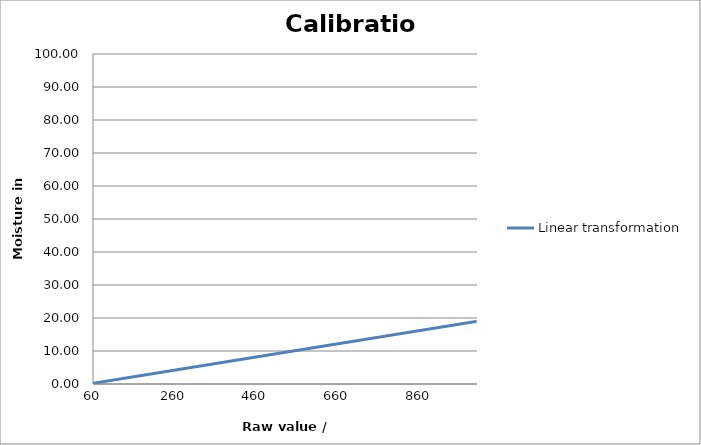
| Category | Linear transformation |
|---|---|
| 60.0 | 0.2 |
| 61.0 | 0.22 |
| 62.0 | 0.24 |
| 63.0 | 0.26 |
| 64.0 | 0.28 |
| 65.0 | 0.3 |
| 66.0 | 0.32 |
| 67.0 | 0.34 |
| 68.0 | 0.36 |
| 69.0 | 0.38 |
| 70.0 | 0.4 |
| 71.0 | 0.42 |
| 72.0 | 0.44 |
| 73.0 | 0.46 |
| 74.0 | 0.48 |
| 75.0 | 0.5 |
| 76.0 | 0.52 |
| 77.0 | 0.54 |
| 78.0 | 0.56 |
| 79.0 | 0.58 |
| 80.0 | 0.6 |
| 81.0 | 0.62 |
| 82.0 | 0.64 |
| 83.0 | 0.66 |
| 84.0 | 0.68 |
| 85.0 | 0.7 |
| 86.0 | 0.72 |
| 87.0 | 0.74 |
| 88.0 | 0.76 |
| 89.0 | 0.78 |
| 90.0 | 0.8 |
| 91.0 | 0.82 |
| 92.0 | 0.84 |
| 93.0 | 0.86 |
| 94.0 | 0.88 |
| 95.0 | 0.9 |
| 96.0 | 0.92 |
| 97.0 | 0.94 |
| 98.0 | 0.96 |
| 99.0 | 0.98 |
| 100.0 | 1 |
| 101.0 | 1.02 |
| 102.0 | 1.04 |
| 103.0 | 1.06 |
| 104.0 | 1.08 |
| 105.0 | 1.1 |
| 106.0 | 1.12 |
| 107.0 | 1.14 |
| 108.0 | 1.16 |
| 109.0 | 1.18 |
| 110.0 | 1.2 |
| 111.0 | 1.22 |
| 112.0 | 1.24 |
| 113.0 | 1.26 |
| 114.0 | 1.28 |
| 115.0 | 1.3 |
| 116.0 | 1.32 |
| 117.0 | 1.34 |
| 118.0 | 1.36 |
| 119.0 | 1.38 |
| 120.0 | 1.4 |
| 121.0 | 1.42 |
| 122.0 | 1.44 |
| 123.0 | 1.46 |
| 124.0 | 1.48 |
| 125.0 | 1.5 |
| 126.0 | 1.52 |
| 127.0 | 1.54 |
| 128.0 | 1.56 |
| 129.0 | 1.58 |
| 130.0 | 1.6 |
| 131.0 | 1.62 |
| 132.0 | 1.64 |
| 133.0 | 1.66 |
| 134.0 | 1.68 |
| 135.0 | 1.7 |
| 136.0 | 1.72 |
| 137.0 | 1.74 |
| 138.0 | 1.76 |
| 139.0 | 1.78 |
| 140.0 | 1.8 |
| 141.0 | 1.82 |
| 142.0 | 1.84 |
| 143.0 | 1.86 |
| 144.0 | 1.88 |
| 145.0 | 1.9 |
| 146.0 | 1.92 |
| 147.0 | 1.94 |
| 148.0 | 1.96 |
| 149.0 | 1.98 |
| 150.0 | 2 |
| 151.0 | 2.02 |
| 152.0 | 2.04 |
| 153.0 | 2.06 |
| 154.0 | 2.08 |
| 155.0 | 2.1 |
| 156.0 | 2.12 |
| 157.0 | 2.14 |
| 158.0 | 2.16 |
| 159.0 | 2.18 |
| 160.0 | 2.2 |
| 161.0 | 2.22 |
| 162.0 | 2.24 |
| 163.0 | 2.26 |
| 164.0 | 2.28 |
| 165.0 | 2.3 |
| 166.0 | 2.32 |
| 167.0 | 2.34 |
| 168.0 | 2.36 |
| 169.0 | 2.38 |
| 170.0 | 2.4 |
| 171.0 | 2.42 |
| 172.0 | 2.44 |
| 173.0 | 2.46 |
| 174.0 | 2.48 |
| 175.0 | 2.5 |
| 176.0 | 2.52 |
| 177.0 | 2.54 |
| 178.0 | 2.56 |
| 179.0 | 2.58 |
| 180.0 | 2.6 |
| 181.0 | 2.62 |
| 182.0 | 2.64 |
| 183.0 | 2.66 |
| 184.0 | 2.68 |
| 185.0 | 2.7 |
| 186.0 | 2.72 |
| 187.0 | 2.74 |
| 188.0 | 2.76 |
| 189.0 | 2.78 |
| 190.0 | 2.8 |
| 191.0 | 2.82 |
| 192.0 | 2.84 |
| 193.0 | 2.86 |
| 194.0 | 2.88 |
| 195.0 | 2.9 |
| 196.0 | 2.92 |
| 197.0 | 2.94 |
| 198.0 | 2.96 |
| 199.0 | 2.98 |
| 200.0 | 3 |
| 201.0 | 3.02 |
| 202.0 | 3.04 |
| 203.0 | 3.06 |
| 204.0 | 3.08 |
| 205.0 | 3.1 |
| 206.0 | 3.12 |
| 207.0 | 3.14 |
| 208.0 | 3.16 |
| 209.0 | 3.18 |
| 210.0 | 3.2 |
| 211.0 | 3.22 |
| 212.0 | 3.24 |
| 213.0 | 3.26 |
| 214.0 | 3.28 |
| 215.0 | 3.3 |
| 216.0 | 3.32 |
| 217.0 | 3.34 |
| 218.0 | 3.36 |
| 219.0 | 3.38 |
| 220.0 | 3.4 |
| 221.0 | 3.42 |
| 222.0 | 3.44 |
| 223.0 | 3.46 |
| 224.0 | 3.48 |
| 225.0 | 3.5 |
| 226.0 | 3.52 |
| 227.0 | 3.54 |
| 228.0 | 3.56 |
| 229.0 | 3.58 |
| 230.0 | 3.6 |
| 231.0 | 3.62 |
| 232.0 | 3.64 |
| 233.0 | 3.66 |
| 234.0 | 3.68 |
| 235.0 | 3.7 |
| 236.0 | 3.72 |
| 237.0 | 3.74 |
| 238.0 | 3.76 |
| 239.0 | 3.78 |
| 240.0 | 3.8 |
| 241.0 | 3.82 |
| 242.0 | 3.84 |
| 243.0 | 3.86 |
| 244.0 | 3.88 |
| 245.0 | 3.9 |
| 246.0 | 3.92 |
| 247.0 | 3.94 |
| 248.0 | 3.96 |
| 249.0 | 3.98 |
| 250.0 | 4 |
| 251.0 | 4.02 |
| 252.0 | 4.04 |
| 253.0 | 4.06 |
| 254.0 | 4.08 |
| 255.0 | 4.1 |
| 256.0 | 4.12 |
| 257.0 | 4.14 |
| 258.0 | 4.16 |
| 259.0 | 4.18 |
| 260.0 | 4.2 |
| 261.0 | 4.22 |
| 262.0 | 4.24 |
| 263.0 | 4.26 |
| 264.0 | 4.28 |
| 265.0 | 4.3 |
| 266.0 | 4.32 |
| 267.0 | 4.34 |
| 268.0 | 4.36 |
| 269.0 | 4.38 |
| 270.0 | 4.4 |
| 271.0 | 4.42 |
| 272.0 | 4.44 |
| 273.0 | 4.46 |
| 274.0 | 4.48 |
| 275.0 | 4.5 |
| 276.0 | 4.52 |
| 277.0 | 4.54 |
| 278.0 | 4.56 |
| 279.0 | 4.58 |
| 280.0 | 4.6 |
| 281.0 | 4.62 |
| 282.0 | 4.64 |
| 283.0 | 4.66 |
| 284.0 | 4.68 |
| 285.0 | 4.7 |
| 286.0 | 4.72 |
| 287.0 | 4.74 |
| 288.0 | 4.76 |
| 289.0 | 4.78 |
| 290.0 | 4.8 |
| 291.0 | 4.82 |
| 292.0 | 4.84 |
| 293.0 | 4.86 |
| 294.0 | 4.88 |
| 295.0 | 4.9 |
| 296.0 | 4.92 |
| 297.0 | 4.94 |
| 298.0 | 4.96 |
| 299.0 | 4.98 |
| 300.0 | 5 |
| 301.0 | 5.02 |
| 302.0 | 5.04 |
| 303.0 | 5.06 |
| 304.0 | 5.08 |
| 305.0 | 5.1 |
| 306.0 | 5.12 |
| 307.0 | 5.14 |
| 308.0 | 5.16 |
| 309.0 | 5.18 |
| 310.0 | 5.2 |
| 311.0 | 5.22 |
| 312.0 | 5.24 |
| 313.0 | 5.26 |
| 314.0 | 5.28 |
| 315.0 | 5.3 |
| 316.0 | 5.32 |
| 317.0 | 5.34 |
| 318.0 | 5.36 |
| 319.0 | 5.38 |
| 320.0 | 5.4 |
| 321.0 | 5.42 |
| 322.0 | 5.44 |
| 323.0 | 5.46 |
| 324.0 | 5.48 |
| 325.0 | 5.5 |
| 326.0 | 5.52 |
| 327.0 | 5.54 |
| 328.0 | 5.56 |
| 329.0 | 5.58 |
| 330.0 | 5.6 |
| 331.0 | 5.62 |
| 332.0 | 5.64 |
| 333.0 | 5.66 |
| 334.0 | 5.68 |
| 335.0 | 5.7 |
| 336.0 | 5.72 |
| 337.0 | 5.74 |
| 338.0 | 5.76 |
| 339.0 | 5.78 |
| 340.0 | 5.8 |
| 341.0 | 5.82 |
| 342.0 | 5.84 |
| 343.0 | 5.86 |
| 344.0 | 5.88 |
| 345.0 | 5.9 |
| 346.0 | 5.92 |
| 347.0 | 5.94 |
| 348.0 | 5.96 |
| 349.0 | 5.98 |
| 350.0 | 6 |
| 351.0 | 6.02 |
| 352.0 | 6.04 |
| 353.0 | 6.06 |
| 354.0 | 6.08 |
| 355.0 | 6.1 |
| 356.0 | 6.12 |
| 357.0 | 6.14 |
| 358.0 | 6.16 |
| 359.0 | 6.18 |
| 360.0 | 6.2 |
| 361.0 | 6.22 |
| 362.0 | 6.24 |
| 363.0 | 6.26 |
| 364.0 | 6.28 |
| 365.0 | 6.3 |
| 366.0 | 6.32 |
| 367.0 | 6.34 |
| 368.0 | 6.36 |
| 369.0 | 6.38 |
| 370.0 | 6.4 |
| 371.0 | 6.42 |
| 372.0 | 6.44 |
| 373.0 | 6.46 |
| 374.0 | 6.48 |
| 375.0 | 6.5 |
| 376.0 | 6.52 |
| 377.0 | 6.54 |
| 378.0 | 6.56 |
| 379.0 | 6.58 |
| 380.0 | 6.6 |
| 381.0 | 6.62 |
| 382.0 | 6.64 |
| 383.0 | 6.66 |
| 384.0 | 6.68 |
| 385.0 | 6.7 |
| 386.0 | 6.72 |
| 387.0 | 6.74 |
| 388.0 | 6.76 |
| 389.0 | 6.78 |
| 390.0 | 6.8 |
| 391.0 | 6.82 |
| 392.0 | 6.84 |
| 393.0 | 6.86 |
| 394.0 | 6.88 |
| 395.0 | 6.9 |
| 396.0 | 6.92 |
| 397.0 | 6.94 |
| 398.0 | 6.96 |
| 399.0 | 6.98 |
| 400.0 | 7 |
| 401.0 | 7.02 |
| 402.0 | 7.04 |
| 403.0 | 7.06 |
| 404.0 | 7.08 |
| 405.0 | 7.1 |
| 406.0 | 7.12 |
| 407.0 | 7.14 |
| 408.0 | 7.16 |
| 409.0 | 7.18 |
| 410.0 | 7.2 |
| 411.0 | 7.22 |
| 412.0 | 7.24 |
| 413.0 | 7.26 |
| 414.0 | 7.28 |
| 415.0 | 7.3 |
| 416.0 | 7.32 |
| 417.0 | 7.34 |
| 418.0 | 7.36 |
| 419.0 | 7.38 |
| 420.0 | 7.4 |
| 421.0 | 7.42 |
| 422.0 | 7.44 |
| 423.0 | 7.46 |
| 424.0 | 7.48 |
| 425.0 | 7.5 |
| 426.0 | 7.52 |
| 427.0 | 7.54 |
| 428.0 | 7.56 |
| 429.0 | 7.58 |
| 430.0 | 7.6 |
| 431.0 | 7.62 |
| 432.0 | 7.64 |
| 433.0 | 7.66 |
| 434.0 | 7.68 |
| 435.0 | 7.7 |
| 436.0 | 7.72 |
| 437.0 | 7.74 |
| 438.0 | 7.76 |
| 439.0 | 7.78 |
| 440.0 | 7.8 |
| 441.0 | 7.82 |
| 442.0 | 7.84 |
| 443.0 | 7.86 |
| 444.0 | 7.88 |
| 445.0 | 7.9 |
| 446.0 | 7.92 |
| 447.0 | 7.94 |
| 448.0 | 7.96 |
| 449.0 | 7.98 |
| 450.0 | 8 |
| 451.0 | 8.02 |
| 452.0 | 8.04 |
| 453.0 | 8.06 |
| 454.0 | 8.08 |
| 455.0 | 8.1 |
| 456.0 | 8.12 |
| 457.0 | 8.14 |
| 458.0 | 8.16 |
| 459.0 | 8.18 |
| 460.0 | 8.2 |
| 461.0 | 8.22 |
| 462.0 | 8.24 |
| 463.0 | 8.26 |
| 464.0 | 8.28 |
| 465.0 | 8.3 |
| 466.0 | 8.32 |
| 467.0 | 8.34 |
| 468.0 | 8.36 |
| 469.0 | 8.38 |
| 470.0 | 8.4 |
| 471.0 | 8.42 |
| 472.0 | 8.44 |
| 473.0 | 8.46 |
| 474.0 | 8.48 |
| 475.0 | 8.5 |
| 476.0 | 8.52 |
| 477.0 | 8.54 |
| 478.0 | 8.56 |
| 479.0 | 8.58 |
| 480.0 | 8.6 |
| 481.0 | 8.62 |
| 482.0 | 8.64 |
| 483.0 | 8.66 |
| 484.0 | 8.68 |
| 485.0 | 8.7 |
| 486.0 | 8.72 |
| 487.0 | 8.74 |
| 488.0 | 8.76 |
| 489.0 | 8.78 |
| 490.0 | 8.8 |
| 491.0 | 8.82 |
| 492.0 | 8.84 |
| 493.0 | 8.86 |
| 494.0 | 8.88 |
| 495.0 | 8.9 |
| 496.0 | 8.92 |
| 497.0 | 8.94 |
| 498.0 | 8.96 |
| 499.0 | 8.98 |
| 500.0 | 9 |
| 501.0 | 9.02 |
| 502.0 | 9.04 |
| 503.0 | 9.06 |
| 504.0 | 9.08 |
| 505.0 | 9.1 |
| 506.0 | 9.12 |
| 507.0 | 9.14 |
| 508.0 | 9.16 |
| 509.0 | 9.18 |
| 510.0 | 9.2 |
| 511.0 | 9.22 |
| 512.0 | 9.24 |
| 513.0 | 9.26 |
| 514.0 | 9.28 |
| 515.0 | 9.3 |
| 516.0 | 9.32 |
| 517.0 | 9.34 |
| 518.0 | 9.36 |
| 519.0 | 9.38 |
| 520.0 | 9.4 |
| 521.0 | 9.42 |
| 522.0 | 9.44 |
| 523.0 | 9.46 |
| 524.0 | 9.48 |
| 525.0 | 9.5 |
| 526.0 | 9.52 |
| 527.0 | 9.54 |
| 528.0 | 9.56 |
| 529.0 | 9.58 |
| 530.0 | 9.6 |
| 531.0 | 9.62 |
| 532.0 | 9.64 |
| 533.0 | 9.66 |
| 534.0 | 9.68 |
| 535.0 | 9.7 |
| 536.0 | 9.72 |
| 537.0 | 9.74 |
| 538.0 | 9.76 |
| 539.0 | 9.78 |
| 540.0 | 9.8 |
| 541.0 | 9.82 |
| 542.0 | 9.84 |
| 543.0 | 9.86 |
| 544.0 | 9.88 |
| 545.0 | 9.9 |
| 546.0 | 9.92 |
| 547.0 | 9.94 |
| 548.0 | 9.96 |
| 549.0 | 9.98 |
| 550.0 | 10 |
| 551.0 | 10.02 |
| 552.0 | 10.04 |
| 553.0 | 10.06 |
| 554.0 | 10.08 |
| 555.0 | 10.1 |
| 556.0 | 10.12 |
| 557.0 | 10.14 |
| 558.0 | 10.16 |
| 559.0 | 10.18 |
| 560.0 | 10.2 |
| 561.0 | 10.22 |
| 562.0 | 10.24 |
| 563.0 | 10.26 |
| 564.0 | 10.28 |
| 565.0 | 10.3 |
| 566.0 | 10.32 |
| 567.0 | 10.34 |
| 568.0 | 10.36 |
| 569.0 | 10.38 |
| 570.0 | 10.4 |
| 571.0 | 10.42 |
| 572.0 | 10.44 |
| 573.0 | 10.46 |
| 574.0 | 10.48 |
| 575.0 | 10.5 |
| 576.0 | 10.52 |
| 577.0 | 10.54 |
| 578.0 | 10.56 |
| 579.0 | 10.58 |
| 580.0 | 10.6 |
| 581.0 | 10.62 |
| 582.0 | 10.64 |
| 583.0 | 10.66 |
| 584.0 | 10.68 |
| 585.0 | 10.7 |
| 586.0 | 10.72 |
| 587.0 | 10.74 |
| 588.0 | 10.76 |
| 589.0 | 10.78 |
| 590.0 | 10.8 |
| 591.0 | 10.82 |
| 592.0 | 10.84 |
| 593.0 | 10.86 |
| 594.0 | 10.88 |
| 595.0 | 10.9 |
| 596.0 | 10.92 |
| 597.0 | 10.94 |
| 598.0 | 10.96 |
| 599.0 | 10.98 |
| 600.0 | 11 |
| 601.0 | 11.02 |
| 602.0 | 11.04 |
| 603.0 | 11.06 |
| 604.0 | 11.08 |
| 605.0 | 11.1 |
| 606.0 | 11.12 |
| 607.0 | 11.14 |
| 608.0 | 11.16 |
| 609.0 | 11.18 |
| 610.0 | 11.2 |
| 611.0 | 11.22 |
| 612.0 | 11.24 |
| 613.0 | 11.26 |
| 614.0 | 11.28 |
| 615.0 | 11.3 |
| 616.0 | 11.32 |
| 617.0 | 11.34 |
| 618.0 | 11.36 |
| 619.0 | 11.38 |
| 620.0 | 11.4 |
| 621.0 | 11.42 |
| 622.0 | 11.44 |
| 623.0 | 11.46 |
| 624.0 | 11.48 |
| 625.0 | 11.5 |
| 626.0 | 11.52 |
| 627.0 | 11.54 |
| 628.0 | 11.56 |
| 629.0 | 11.58 |
| 630.0 | 11.6 |
| 631.0 | 11.62 |
| 632.0 | 11.64 |
| 633.0 | 11.66 |
| 634.0 | 11.68 |
| 635.0 | 11.7 |
| 636.0 | 11.72 |
| 637.0 | 11.74 |
| 638.0 | 11.76 |
| 639.0 | 11.78 |
| 640.0 | 11.8 |
| 641.0 | 11.82 |
| 642.0 | 11.84 |
| 643.0 | 11.86 |
| 644.0 | 11.88 |
| 645.0 | 11.9 |
| 646.0 | 11.92 |
| 647.0 | 11.94 |
| 648.0 | 11.96 |
| 649.0 | 11.98 |
| 650.0 | 12 |
| 651.0 | 12.02 |
| 652.0 | 12.04 |
| 653.0 | 12.06 |
| 654.0 | 12.08 |
| 655.0 | 12.1 |
| 656.0 | 12.12 |
| 657.0 | 12.14 |
| 658.0 | 12.16 |
| 659.0 | 12.18 |
| 660.0 | 12.2 |
| 661.0 | 12.22 |
| 662.0 | 12.24 |
| 663.0 | 12.26 |
| 664.0 | 12.28 |
| 665.0 | 12.3 |
| 666.0 | 12.32 |
| 667.0 | 12.34 |
| 668.0 | 12.36 |
| 669.0 | 12.38 |
| 670.0 | 12.4 |
| 671.0 | 12.42 |
| 672.0 | 12.44 |
| 673.0 | 12.46 |
| 674.0 | 12.48 |
| 675.0 | 12.5 |
| 676.0 | 12.52 |
| 677.0 | 12.54 |
| 678.0 | 12.56 |
| 679.0 | 12.58 |
| 680.0 | 12.6 |
| 681.0 | 12.62 |
| 682.0 | 12.64 |
| 683.0 | 12.66 |
| 684.0 | 12.68 |
| 685.0 | 12.7 |
| 686.0 | 12.72 |
| 687.0 | 12.74 |
| 688.0 | 12.76 |
| 689.0 | 12.78 |
| 690.0 | 12.8 |
| 691.0 | 12.82 |
| 692.0 | 12.84 |
| 693.0 | 12.86 |
| 694.0 | 12.88 |
| 695.0 | 12.9 |
| 696.0 | 12.92 |
| 697.0 | 12.94 |
| 698.0 | 12.96 |
| 699.0 | 12.98 |
| 700.0 | 13 |
| 701.0 | 13.02 |
| 702.0 | 13.04 |
| 703.0 | 13.06 |
| 704.0 | 13.08 |
| 705.0 | 13.1 |
| 706.0 | 13.12 |
| 707.0 | 13.14 |
| 708.0 | 13.16 |
| 709.0 | 13.18 |
| 710.0 | 13.2 |
| 711.0 | 13.22 |
| 712.0 | 13.24 |
| 713.0 | 13.26 |
| 714.0 | 13.28 |
| 715.0 | 13.3 |
| 716.0 | 13.32 |
| 717.0 | 13.34 |
| 718.0 | 13.36 |
| 719.0 | 13.38 |
| 720.0 | 13.4 |
| 721.0 | 13.42 |
| 722.0 | 13.44 |
| 723.0 | 13.46 |
| 724.0 | 13.48 |
| 725.0 | 13.5 |
| 726.0 | 13.52 |
| 727.0 | 13.54 |
| 728.0 | 13.56 |
| 729.0 | 13.58 |
| 730.0 | 13.6 |
| 731.0 | 13.62 |
| 732.0 | 13.64 |
| 733.0 | 13.66 |
| 734.0 | 13.68 |
| 735.0 | 13.7 |
| 736.0 | 13.72 |
| 737.0 | 13.74 |
| 738.0 | 13.76 |
| 739.0 | 13.78 |
| 740.0 | 13.8 |
| 741.0 | 13.82 |
| 742.0 | 13.84 |
| 743.0 | 13.86 |
| 744.0 | 13.88 |
| 745.0 | 13.9 |
| 746.0 | 13.92 |
| 747.0 | 13.94 |
| 748.0 | 13.96 |
| 749.0 | 13.98 |
| 750.0 | 14 |
| 751.0 | 14.02 |
| 752.0 | 14.04 |
| 753.0 | 14.06 |
| 754.0 | 14.08 |
| 755.0 | 14.1 |
| 756.0 | 14.12 |
| 757.0 | 14.14 |
| 758.0 | 14.16 |
| 759.0 | 14.18 |
| 760.0 | 14.2 |
| 761.0 | 14.22 |
| 762.0 | 14.24 |
| 763.0 | 14.26 |
| 764.0 | 14.28 |
| 765.0 | 14.3 |
| 766.0 | 14.32 |
| 767.0 | 14.34 |
| 768.0 | 14.36 |
| 769.0 | 14.38 |
| 770.0 | 14.4 |
| 771.0 | 14.42 |
| 772.0 | 14.44 |
| 773.0 | 14.46 |
| 774.0 | 14.48 |
| 775.0 | 14.5 |
| 776.0 | 14.52 |
| 777.0 | 14.54 |
| 778.0 | 14.56 |
| 779.0 | 14.58 |
| 780.0 | 14.6 |
| 781.0 | 14.62 |
| 782.0 | 14.64 |
| 783.0 | 14.66 |
| 784.0 | 14.68 |
| 785.0 | 14.7 |
| 786.0 | 14.72 |
| 787.0 | 14.74 |
| 788.0 | 14.76 |
| 789.0 | 14.78 |
| 790.0 | 14.8 |
| 791.0 | 14.82 |
| 792.0 | 14.84 |
| 793.0 | 14.86 |
| 794.0 | 14.88 |
| 795.0 | 14.9 |
| 796.0 | 14.92 |
| 797.0 | 14.94 |
| 798.0 | 14.96 |
| 799.0 | 14.98 |
| 800.0 | 15 |
| 801.0 | 15.02 |
| 802.0 | 15.04 |
| 803.0 | 15.06 |
| 804.0 | 15.08 |
| 805.0 | 15.1 |
| 806.0 | 15.12 |
| 807.0 | 15.14 |
| 808.0 | 15.16 |
| 809.0 | 15.18 |
| 810.0 | 15.2 |
| 811.0 | 15.22 |
| 812.0 | 15.24 |
| 813.0 | 15.26 |
| 814.0 | 15.28 |
| 815.0 | 15.3 |
| 816.0 | 15.32 |
| 817.0 | 15.34 |
| 818.0 | 15.36 |
| 819.0 | 15.38 |
| 820.0 | 15.4 |
| 821.0 | 15.42 |
| 822.0 | 15.44 |
| 823.0 | 15.46 |
| 824.0 | 15.48 |
| 825.0 | 15.5 |
| 826.0 | 15.52 |
| 827.0 | 15.54 |
| 828.0 | 15.56 |
| 829.0 | 15.58 |
| 830.0 | 15.6 |
| 831.0 | 15.62 |
| 832.0 | 15.64 |
| 833.0 | 15.66 |
| 834.0 | 15.68 |
| 835.0 | 15.7 |
| 836.0 | 15.72 |
| 837.0 | 15.74 |
| 838.0 | 15.76 |
| 839.0 | 15.78 |
| 840.0 | 15.8 |
| 841.0 | 15.82 |
| 842.0 | 15.84 |
| 843.0 | 15.86 |
| 844.0 | 15.88 |
| 845.0 | 15.9 |
| 846.0 | 15.92 |
| 847.0 | 15.94 |
| 848.0 | 15.96 |
| 849.0 | 15.98 |
| 850.0 | 16 |
| 851.0 | 16.02 |
| 852.0 | 16.04 |
| 853.0 | 16.06 |
| 854.0 | 16.08 |
| 855.0 | 16.1 |
| 856.0 | 16.12 |
| 857.0 | 16.14 |
| 858.0 | 16.16 |
| 859.0 | 16.18 |
| 860.0 | 16.2 |
| 861.0 | 16.22 |
| 862.0 | 16.24 |
| 863.0 | 16.26 |
| 864.0 | 16.28 |
| 865.0 | 16.3 |
| 866.0 | 16.32 |
| 867.0 | 16.34 |
| 868.0 | 16.36 |
| 869.0 | 16.38 |
| 870.0 | 16.4 |
| 871.0 | 16.42 |
| 872.0 | 16.44 |
| 873.0 | 16.46 |
| 874.0 | 16.48 |
| 875.0 | 16.5 |
| 876.0 | 16.52 |
| 877.0 | 16.54 |
| 878.0 | 16.56 |
| 879.0 | 16.58 |
| 880.0 | 16.6 |
| 881.0 | 16.62 |
| 882.0 | 16.64 |
| 883.0 | 16.66 |
| 884.0 | 16.68 |
| 885.0 | 16.7 |
| 886.0 | 16.72 |
| 887.0 | 16.74 |
| 888.0 | 16.76 |
| 889.0 | 16.78 |
| 890.0 | 16.8 |
| 891.0 | 16.82 |
| 892.0 | 16.84 |
| 893.0 | 16.86 |
| 894.0 | 16.88 |
| 895.0 | 16.9 |
| 896.0 | 16.92 |
| 897.0 | 16.94 |
| 898.0 | 16.96 |
| 899.0 | 16.98 |
| 900.0 | 17 |
| 901.0 | 17.02 |
| 902.0 | 17.04 |
| 903.0 | 17.06 |
| 904.0 | 17.08 |
| 905.0 | 17.1 |
| 906.0 | 17.12 |
| 907.0 | 17.14 |
| 908.0 | 17.16 |
| 909.0 | 17.18 |
| 910.0 | 17.2 |
| 911.0 | 17.22 |
| 912.0 | 17.24 |
| 913.0 | 17.26 |
| 914.0 | 17.28 |
| 915.0 | 17.3 |
| 916.0 | 17.32 |
| 917.0 | 17.34 |
| 918.0 | 17.36 |
| 919.0 | 17.38 |
| 920.0 | 17.4 |
| 921.0 | 17.42 |
| 922.0 | 17.44 |
| 923.0 | 17.46 |
| 924.0 | 17.48 |
| 925.0 | 17.5 |
| 926.0 | 17.52 |
| 927.0 | 17.54 |
| 928.0 | 17.56 |
| 929.0 | 17.58 |
| 930.0 | 17.6 |
| 931.0 | 17.62 |
| 932.0 | 17.64 |
| 933.0 | 17.66 |
| 934.0 | 17.68 |
| 935.0 | 17.7 |
| 936.0 | 17.72 |
| 937.0 | 17.74 |
| 938.0 | 17.76 |
| 939.0 | 17.78 |
| 940.0 | 17.8 |
| 941.0 | 17.82 |
| 942.0 | 17.84 |
| 943.0 | 17.86 |
| 944.0 | 17.88 |
| 945.0 | 17.9 |
| 946.0 | 17.92 |
| 947.0 | 17.94 |
| 948.0 | 17.96 |
| 949.0 | 17.98 |
| 950.0 | 18 |
| 951.0 | 18.02 |
| 952.0 | 18.04 |
| 953.0 | 18.06 |
| 954.0 | 18.08 |
| 955.0 | 18.1 |
| 956.0 | 18.12 |
| 957.0 | 18.14 |
| 958.0 | 18.16 |
| 959.0 | 18.18 |
| 960.0 | 18.2 |
| 961.0 | 18.22 |
| 962.0 | 18.24 |
| 963.0 | 18.26 |
| 964.0 | 18.28 |
| 965.0 | 18.3 |
| 966.0 | 18.32 |
| 967.0 | 18.34 |
| 968.0 | 18.36 |
| 969.0 | 18.38 |
| 970.0 | 18.4 |
| 971.0 | 18.42 |
| 972.0 | 18.44 |
| 973.0 | 18.46 |
| 974.0 | 18.48 |
| 975.0 | 18.5 |
| 976.0 | 18.52 |
| 977.0 | 18.54 |
| 978.0 | 18.56 |
| 979.0 | 18.58 |
| 980.0 | 18.6 |
| 981.0 | 18.62 |
| 982.0 | 18.64 |
| 983.0 | 18.66 |
| 984.0 | 18.68 |
| 985.0 | 18.7 |
| 986.0 | 18.72 |
| 987.0 | 18.74 |
| 988.0 | 18.76 |
| 989.0 | 18.78 |
| 990.0 | 18.8 |
| 991.0 | 18.82 |
| 992.0 | 18.84 |
| 993.0 | 18.86 |
| 994.0 | 18.88 |
| 995.0 | 18.9 |
| 996.0 | 18.92 |
| 997.0 | 18.94 |
| 998.0 | 18.96 |
| 999.0 | 18.98 |
| 1000.0 | 19 |